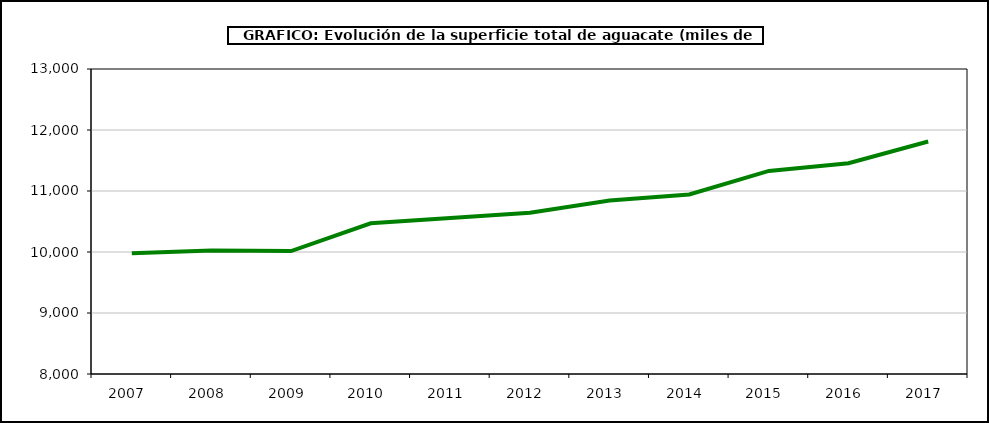
| Category | superficie aguacate |
|---|---|
| 2007.0 | 9981 |
| 2008.0 | 10023 |
| 2009.0 | 10016 |
| 2010.0 | 10470 |
| 2011.0 | 10558 |
| 2012.0 | 10645 |
| 2013.0 | 10845 |
| 2014.0 | 10943 |
| 2015.0 | 11329 |
| 2016.0 | 11455 |
| 2017.0 | 11812 |